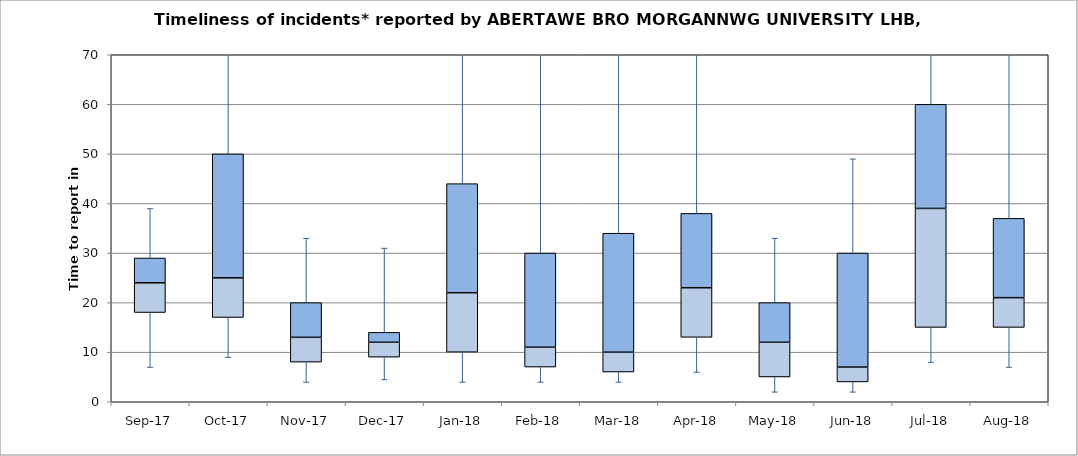
| Category | Series 0 | Series 1 | Series 2 |
|---|---|---|---|
| Sep-17 | 18 | 6 | 5 |
| Oct-17 | 17 | 8 | 25 |
| Nov-17 | 8 | 5 | 7 |
| Dec-17 | 9 | 3 | 2 |
| Jan-18 | 10 | 12 | 22 |
| Feb-18 | 7 | 4 | 19 |
| Mar-18 | 6 | 4 | 24 |
| Apr-18 | 13 | 10 | 15 |
| May-18 | 5 | 7 | 8 |
| Jun-18 | 4 | 3 | 23 |
| Jul-18 | 15 | 24 | 21 |
| Aug-18 | 15 | 6 | 16 |